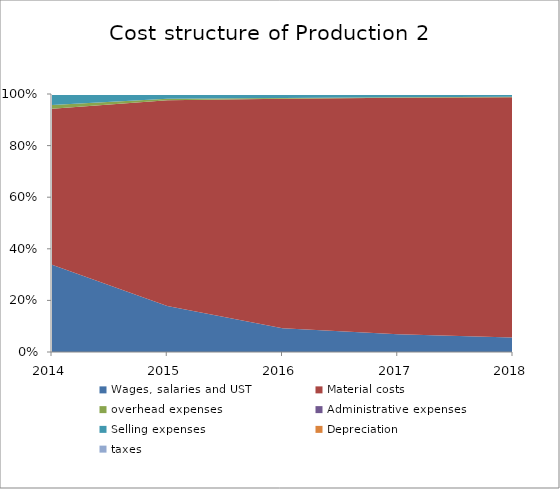
| Category | Wages, salaries and UST | Material costs | overhead expenses | Administrative expenses | Selling expenses | Depreciation | taxes |
|---|---|---|---|---|---|---|---|
| 2014.0 | 0.338 | 0.605 | 0.014 | 0 | 0.043 | 0 | 0 |
| 2015.0 | 0.179 | 0.798 | 0.005 | 0 | 0.019 | 0 | 0 |
| 2016.0 | 0.092 | 0.89 | 0.003 | 0 | 0.016 | 0 | 0 |
| 2017.0 | 0.068 | 0.917 | 0.002 | 0 | 0.013 | 0 | 0 |
| 2018.0 | 0.056 | 0.932 | 0.002 | 0 | 0.01 | 0 | 0 |